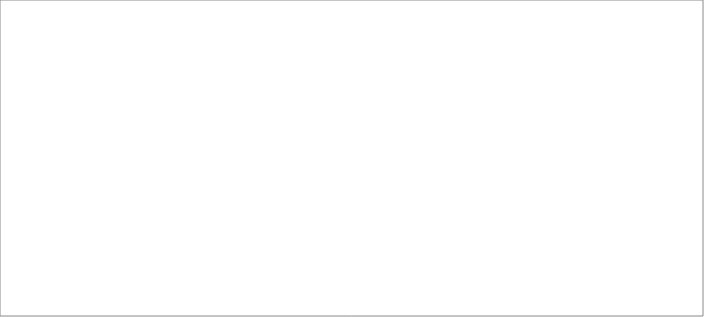
| Category | PreC | PostC |
|---|---|---|
| 0 | 1 | 1 |